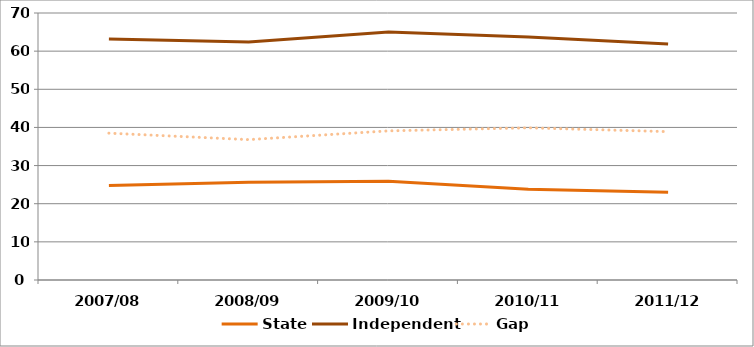
| Category | State | Independent | Gap |
|---|---|---|---|
| 2007/08 | 24.8 | 63.2 | 38.5 |
| 2008/09 | 25.6 | 62.4 | 36.8 |
| 2009/10 | 25.9 | 65 | 39.1 |
| 2010/11 | 23.8 | 63.7 | 39.9 |
| 2011/12 | 23 | 61.9 | 38.9 |